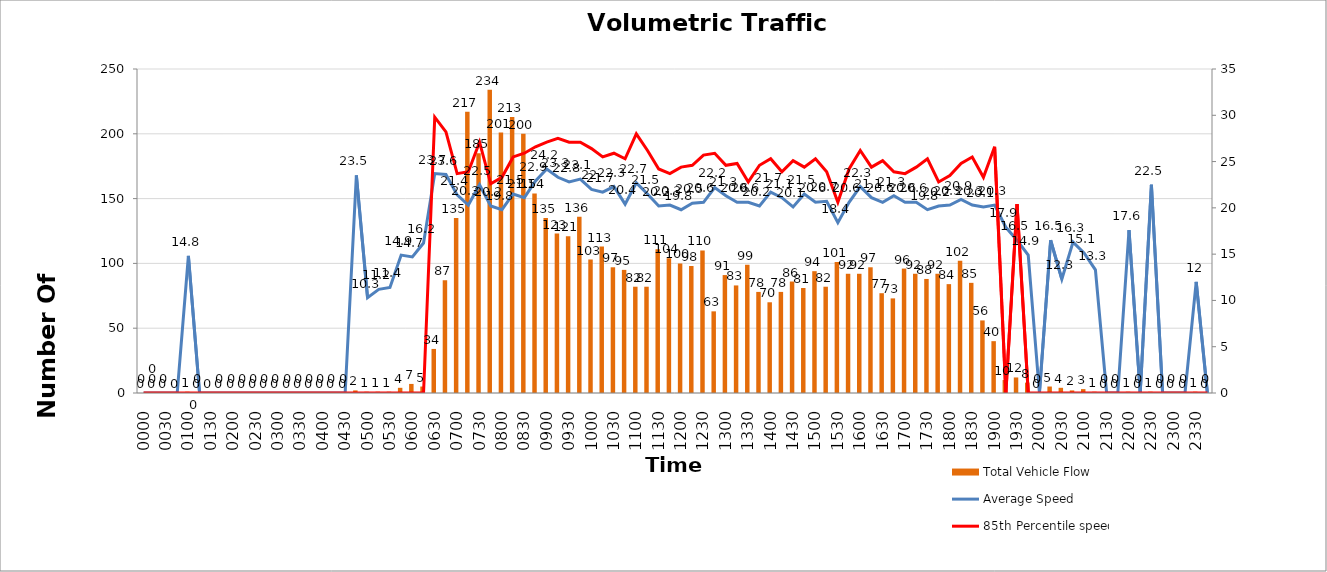
| Category | Total Vehicle Flow |
|---|---|
| 0000 | 0 |
| 0015 | 0 |
| 0030 | 0 |
| 0045 | 0 |
| 0100 | 1 |
| 0115 | 0 |
| 0130 | 0 |
| 0145 | 0 |
| 0200 | 0 |
| 0215 | 0 |
| 0230 | 0 |
| 0245 | 0 |
| 0300 | 0 |
| 0315 | 0 |
| 0330 | 0 |
| 0345 | 0 |
| 0400 | 0 |
| 0415 | 0 |
| 0430 | 0 |
| 0445 | 2 |
| 0500 | 1 |
| 0515 | 1 |
| 0530 | 1 |
| 0545 | 4 |
| 0600 | 7 |
| 0615 | 5 |
| 0630 | 34 |
| 0645 | 87 |
| 0700 | 135 |
| 0715 | 217 |
| 0730 | 185 |
| 0745 | 234 |
| 0800 | 201 |
| 0815 | 213 |
| 0830 | 200 |
| 0845 | 154 |
| 0900 | 135 |
| 0915 | 123 |
| 0930 | 121 |
| 0945 | 136 |
| 1000 | 103 |
| 1015 | 113 |
| 1030 | 97 |
| 1045 | 95 |
| 1100 | 82 |
| 1115 | 82 |
| 1130 | 111 |
| 1145 | 104 |
| 1200 | 100 |
| 1215 | 98 |
| 1230 | 110 |
| 1245 | 63 |
| 1300 | 91 |
| 1315 | 83 |
| 1330 | 99 |
| 1345 | 78 |
| 1400 | 70 |
| 1415 | 78 |
| 1430 | 86 |
| 1445 | 81 |
| 1500 | 94 |
| 1515 | 82 |
| 1530 | 101 |
| 1545 | 92 |
| 1600 | 92 |
| 1615 | 97 |
| 1630 | 77 |
| 1645 | 73 |
| 1700 | 96 |
| 1715 | 92 |
| 1730 | 88 |
| 1745 | 92 |
| 1800 | 84 |
| 1815 | 102 |
| 1830 | 85 |
| 1845 | 56 |
| 1900 | 40 |
| 1915 | 10 |
| 1930 | 12 |
| 1945 | 8 |
| 2000 | 0 |
| 2015 | 5 |
| 2030 | 4 |
| 2045 | 2 |
| 2100 | 3 |
| 2115 | 1 |
| 2130 | 0 |
| 2145 | 0 |
| 2200 | 1 |
| 2215 | 0 |
| 2230 | 1 |
| 2245 | 0 |
| 2300 | 0 |
| 2315 | 0 |
| 2330 | 1 |
| 2345 | 0 |